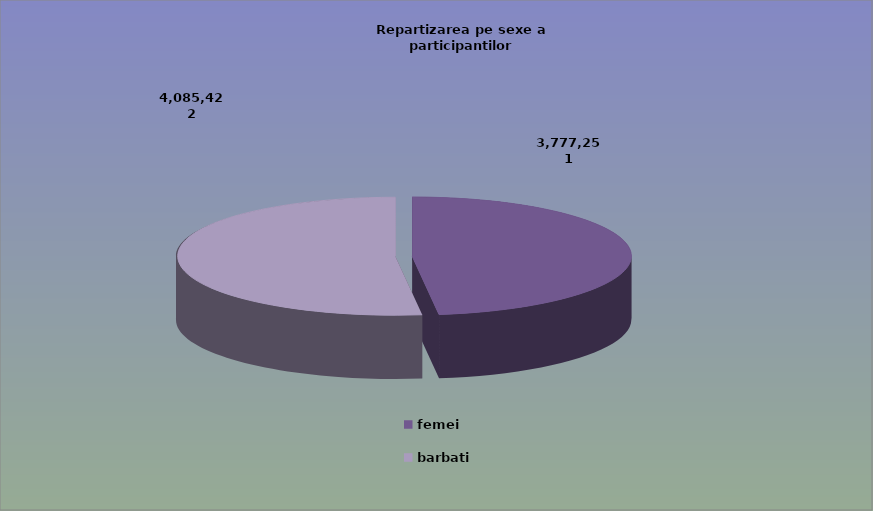
| Category | Series 0 |
|---|---|
| femei | 3777251 |
| barbati | 4085422 |